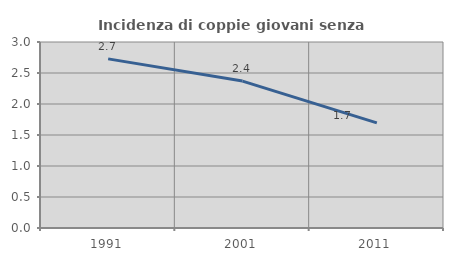
| Category | Incidenza di coppie giovani senza figli |
|---|---|
| 1991.0 | 2.728 |
| 2001.0 | 2.37 |
| 2011.0 | 1.695 |